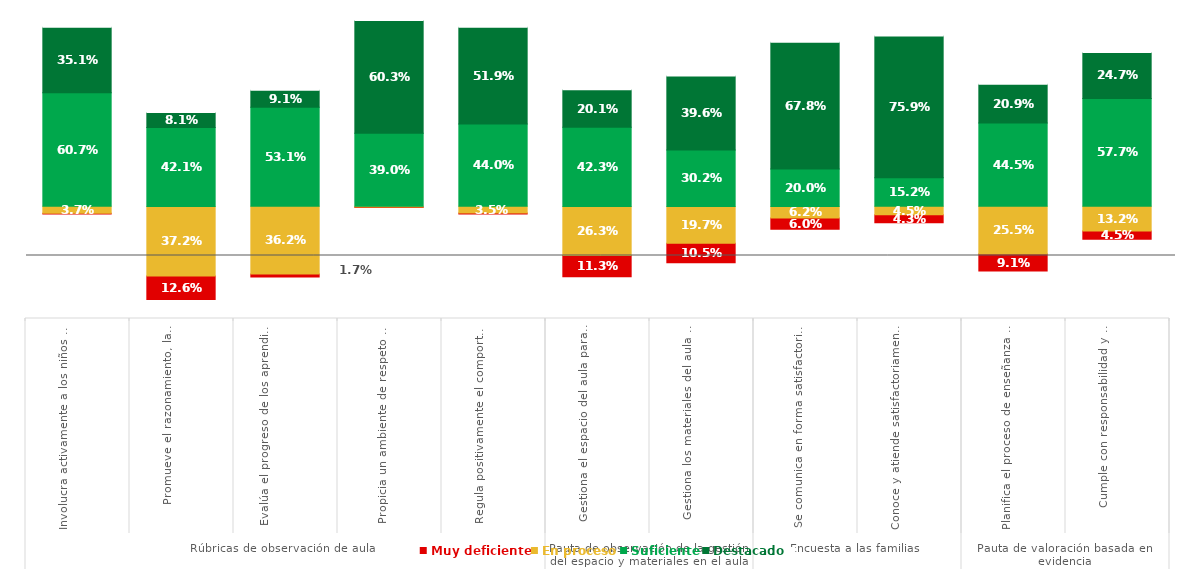
| Category |   | Muy deficiente | En proceso | Suficiente | Destacado |
|---|---|---|---|---|---|
| 0 | 0.041 | 0.004 | 0.037 | 0.607 | 0.351 |
| 1 | 0.498 | 0.126 | 0.372 | 0.421 | 0.081 |
| 2 | 0.378 | 0.017 | 0.362 | 0.531 | 0.091 |
| 3 | 0.006 | 0.002 | 0.004 | 0.39 | 0.603 |
| 4 | 0.041 | 0.006 | 0.035 | 0.44 | 0.519 |
| 5 | 0.376 | 0.113 | 0.263 | 0.423 | 0.201 |
| 6 | 0.302 | 0.105 | 0.197 | 0.302 | 0.396 |
| 7 | 0.122 | 0.06 | 0.062 | 0.2 | 0.678 |
| 8 | 0.088 | 0.043 | 0.045 | 0.152 | 0.759 |
| 9 | 0.346 | 0.091 | 0.255 | 0.445 | 0.209 |
| 10 | 0.176 | 0.045 | 0.132 | 0.577 | 0.247 |